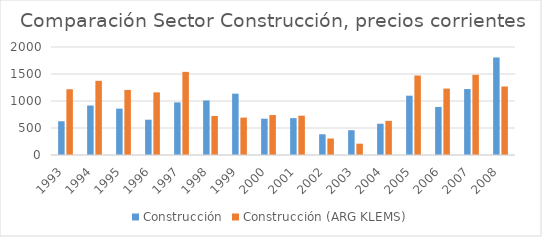
| Category | Construcción | Construcción (ARG KLEMS) |
|---|---|---|
| 1993.0 | 625.169 | 1217.633 |
| 1994.0 | 916.385 | 1373.303 |
| 1995.0 | 858.63 | 1204.746 |
| 1996.0 | 653.568 | 1159.386 |
| 1997.0 | 974.471 | 1539.484 |
| 1998.0 | 1010.201 | 722.007 |
| 1999.0 | 1135.463 | 692.731 |
| 2000.0 | 672.17 | 739.583 |
| 2001.0 | 682.669 | 727.997 |
| 2002.0 | 383.615 | 305.406 |
| 2003.0 | 458.851 | 209.675 |
| 2004.0 | 578.809 | 631.904 |
| 2005.0 | 1098.525 | 1471.674 |
| 2006.0 | 889.765 | 1229.644 |
| 2007.0 | 1221.062 | 1484.624 |
| 2008.0 | 1806.35 | 1268.575 |